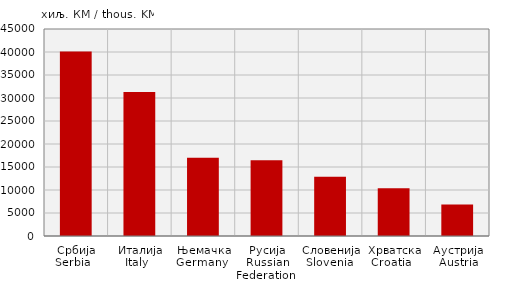
| Category | Увоз
Import |
|---|---|
| Србија
Serbia   | 40094 |
| Италија
Italy   | 31284 |
| Њемачка
Germany  | 17020 |
| Русија
Russian Federation  | 16467 |
| Словенија
Slovenia  | 12880 |
| Хрватска
Croatia   | 10403 |
| Аустрија
Austria | 6821 |